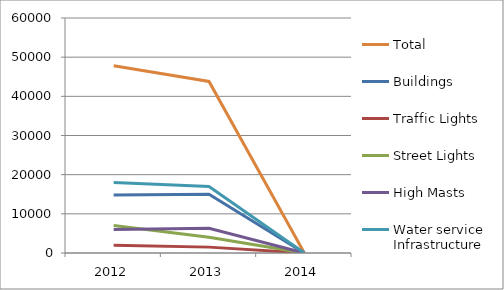
| Category | Total | Buildings | Traffic Lights | Street Lights | High Masts | Water service Infrastructure |
|---|---|---|---|---|---|---|
| 2012 | 47800 | 14800 | 2000 | 7000 | 6000 | 18000 |
| 2013 | 43800 | 15000 | 1500 | 4000 | 6300 | 17000 |
| 2014 | 0 | 0 | 0 | 0 | 0 | 0 |